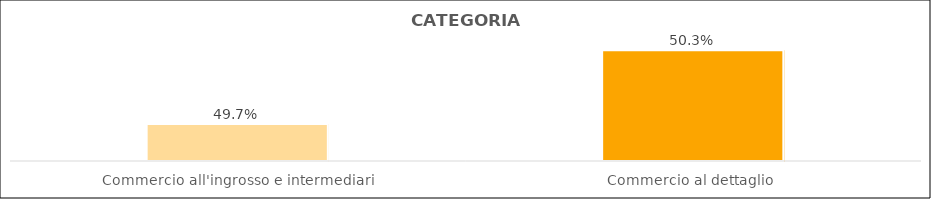
| Category | Series 0 |
|---|---|
| Commercio all'ingrosso e intermediari | 0.497 |
| Commercio al dettaglio  | 0.503 |